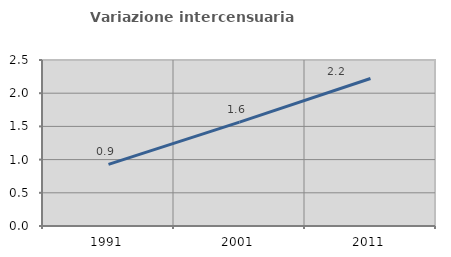
| Category | Variazione intercensuaria annua |
|---|---|
| 1991.0 | 0.928 |
| 2001.0 | 1.564 |
| 2011.0 | 2.222 |